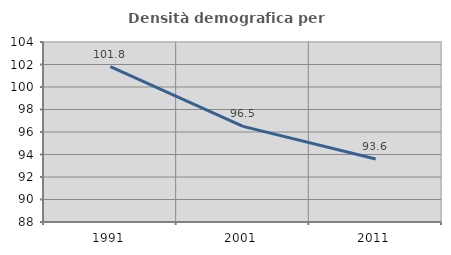
| Category | Densità demografica |
|---|---|
| 1991.0 | 101.816 |
| 2001.0 | 96.498 |
| 2011.0 | 93.597 |